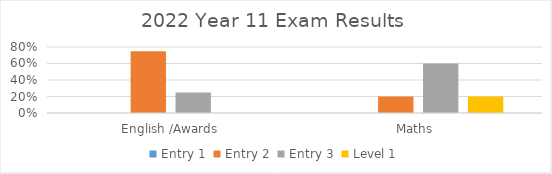
| Category | Entry 1 | Entry 2 | Entry 3 | Level 1 |
|---|---|---|---|---|
| English /Awards | 0 | 0.75 | 0.25 | 0 |
| Maths  | 0 | 0.2 | 0.6 | 0.2 |